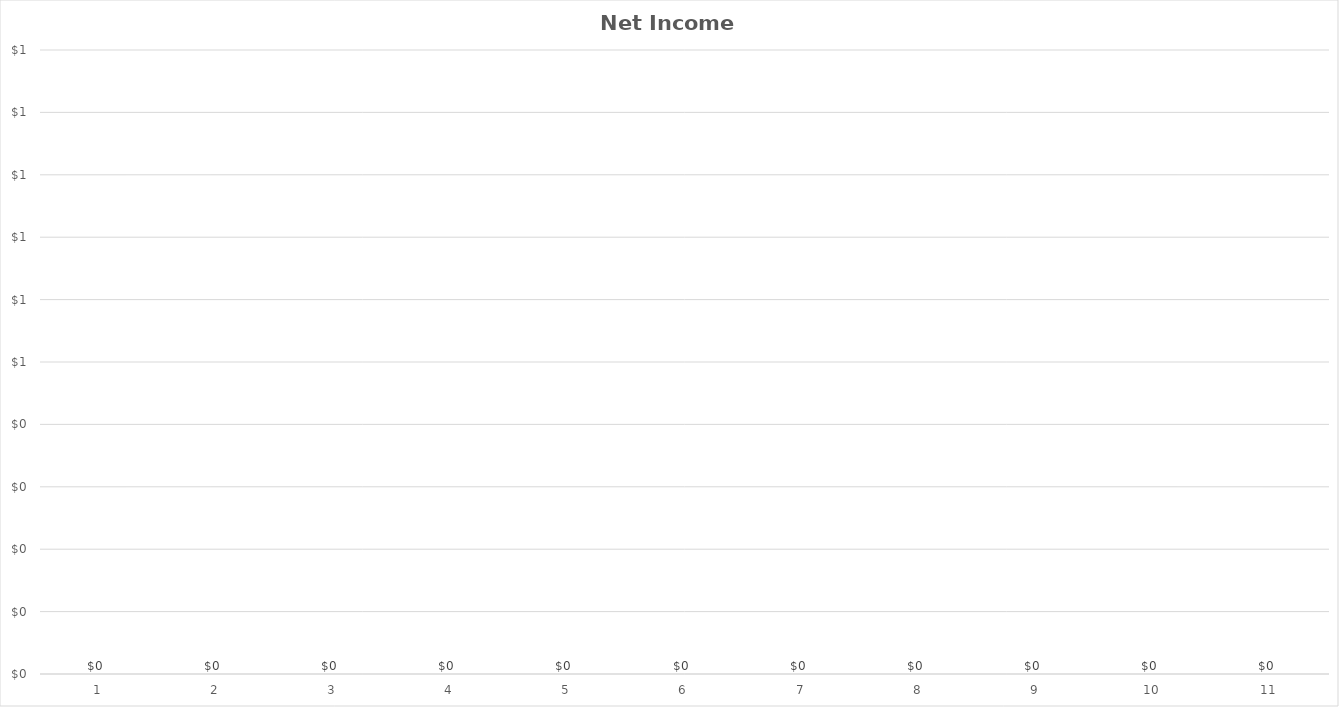
| Category | Net Income w/allocation |
|---|---|
| 0 | 0 |
| 1 | 0 |
| 2 | 0 |
| 3 | 0 |
| 4 | 0 |
| 5 | 0 |
| 6 | 0 |
| 7 | 0 |
| 8 | 0 |
| 9 | 0 |
| 10 | 0 |